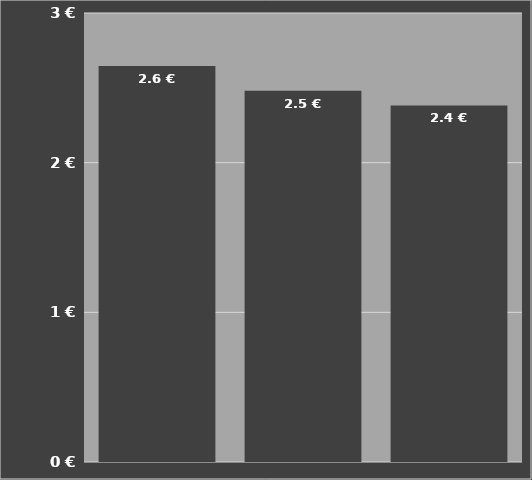
| Category | Kosten je m³
inklusive Schlepper |
|---|---|
| Container 58 m³
mit Pumpstation | 1900-01-02 15:29:24 |
| Container 58 m³
mit Pumpstation | 1900-01-02 11:32:31 |
| Container 58 m³
mit Pumpstation | 1900-01-02 09:10:23 |